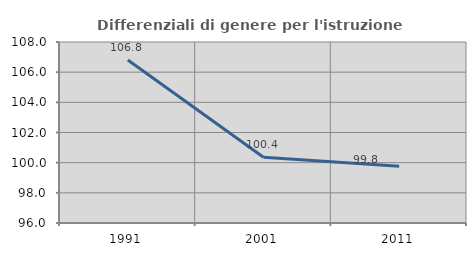
| Category | Differenziali di genere per l'istruzione superiore |
|---|---|
| 1991.0 | 106.805 |
| 2001.0 | 100.357 |
| 2011.0 | 99.768 |